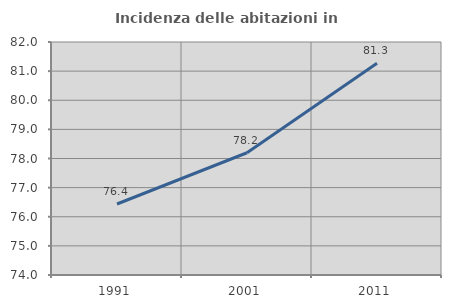
| Category | Incidenza delle abitazioni in proprietà  |
|---|---|
| 1991.0 | 76.437 |
| 2001.0 | 78.197 |
| 2011.0 | 81.27 |